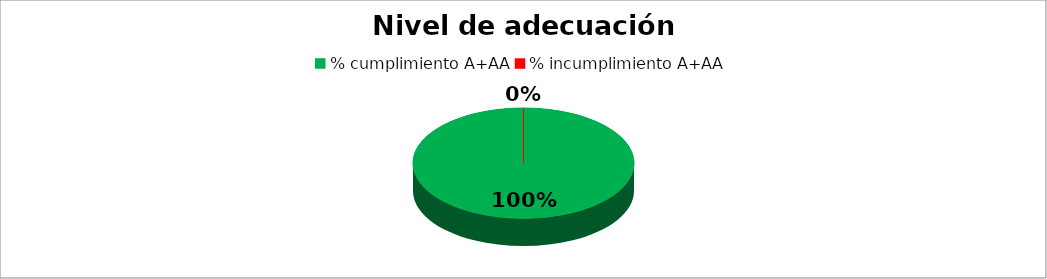
| Category | Series 0 |
|---|---|
| % cumplimiento A+AA | 100 |
| % incumplimiento A+AA | 0 |